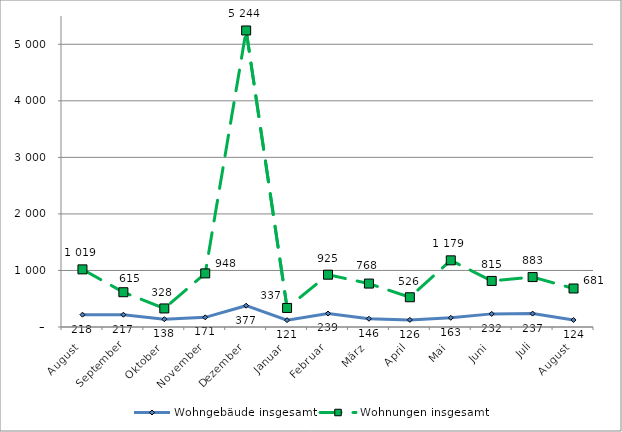
| Category | Wohngebäude insgesamt | Wohnungen insgesamt |
|---|---|---|
| August | 218 | 1019 |
| September | 217 | 615 |
| Oktober | 138 | 328 |
| November | 171 | 948 |
| Dezember | 377 | 5244 |
| Januar | 121 | 337 |
| Februar | 239 | 925 |
| März | 146 | 768 |
| April | 126 | 526 |
| Mai | 163 | 1179 |
| Juni | 232 | 815 |
| Juli | 237 | 883 |
| August | 124 | 681 |